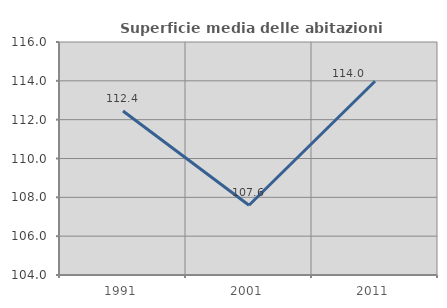
| Category | Superficie media delle abitazioni occupate |
|---|---|
| 1991.0 | 112.445 |
| 2001.0 | 107.594 |
| 2011.0 | 113.981 |